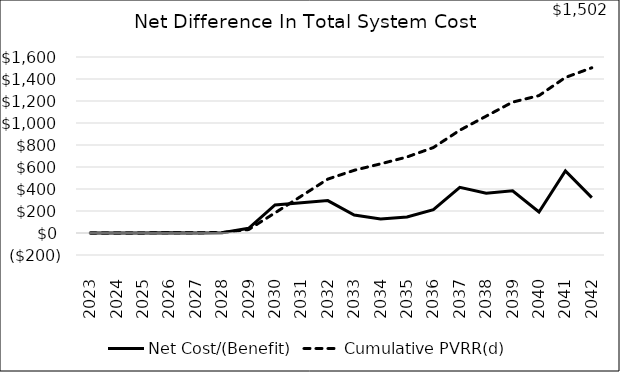
| Category | Net Cost/(Benefit) | Cumulative PVRR(d) |
|---|---|---|
| 2023.0 | -0.054 | 0.054 |
| 2024.0 | 0.235 | 0.156 |
| 2025.0 | 0.43 | 0.51 |
| 2026.0 | 3.358 | 3.102 |
| 2027.0 | -0.566 | 2.693 |
| 2028.0 | 2.227 | 4.203 |
| 2029.0 | 42.387 | 31.141 |
| 2030.0 | 254.824 | 182.934 |
| 2031.0 | 274.18 | 336.015 |
| 2032.0 | 294.622 | 490.195 |
| 2033.0 | 163.178 | 570.234 |
| 2034.0 | 127.207 | 628.716 |
| 2035.0 | 144.882 | 691.148 |
| 2036.0 | 212.585 | 777.01 |
| 2037.0 | 415.249 | 934.21 |
| 2038.0 | 361.084 | 1062.334 |
| 2039.0 | 383.265 | 1189.8 |
| 2040.0 | 190.688 | 1249.243 |
| 2041.0 | 563.738 | 1413.955 |
| 2042.0 | 321.305 | 1501.947 |